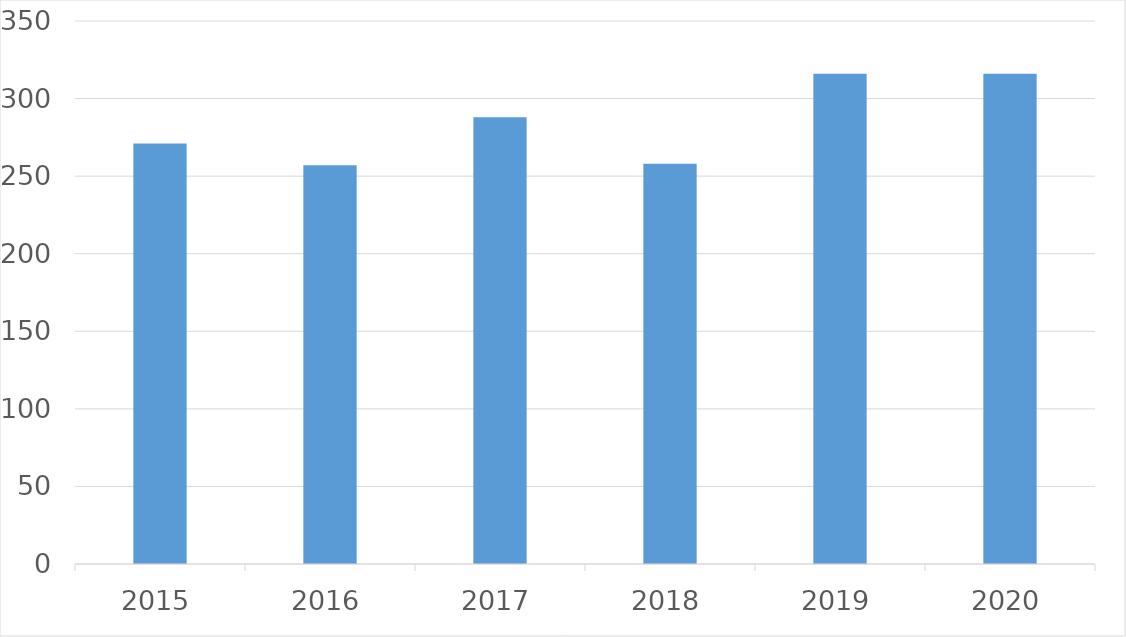
| Category | Series 0 |
|---|---|
| 2015 | 271 |
| 2016 | 257 |
| 2017 | 288 |
| 2018 | 258 |
| 2019 | 316 |
| 2020 | 316 |